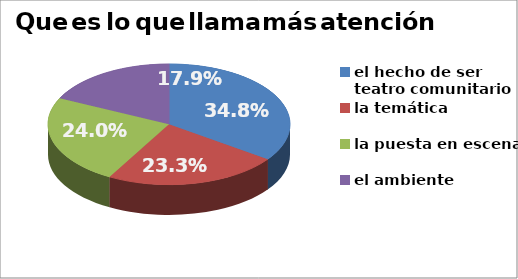
| Category | Series 0 |
|---|---|
| el hecho de ser  teatro comunitario | 0.348 |
| la temática | 0.233 |
| la puesta en escena | 0.24 |
| el ambiente | 0.179 |